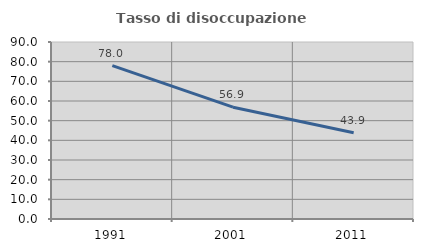
| Category | Tasso di disoccupazione giovanile  |
|---|---|
| 1991.0 | 77.953 |
| 2001.0 | 56.863 |
| 2011.0 | 43.902 |